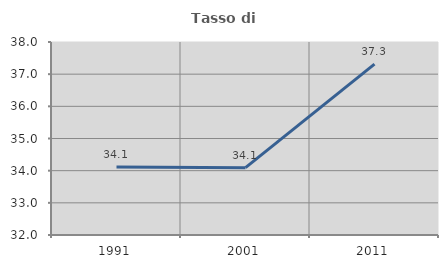
| Category | Tasso di occupazione   |
|---|---|
| 1991.0 | 34.113 |
| 2001.0 | 34.093 |
| 2011.0 | 37.312 |